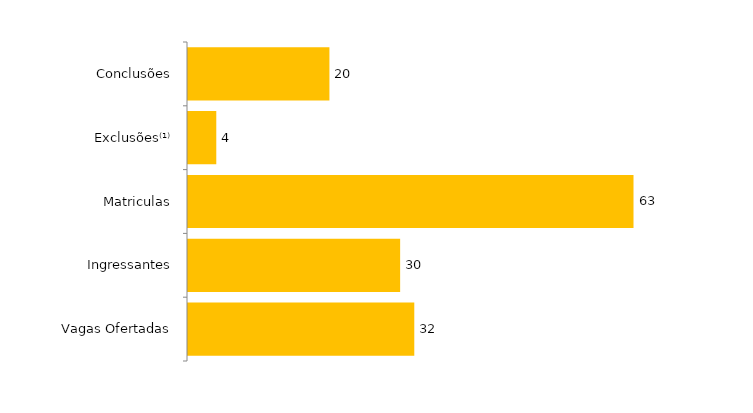
| Category | Total (2017) |
|---|---|
| Vagas Ofertadas | 32 |
| Ingressantes | 30 |
| Matriculas | 63 |
| Exclusões⁽¹⁾ | 4 |
| Conclusões | 20 |